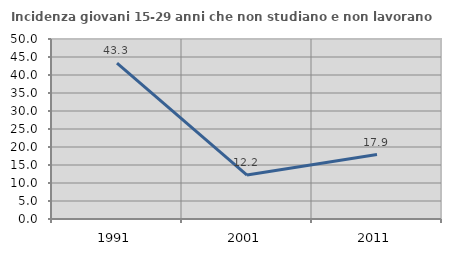
| Category | Incidenza giovani 15-29 anni che non studiano e non lavorano  |
|---|---|
| 1991.0 | 43.295 |
| 2001.0 | 12.217 |
| 2011.0 | 17.891 |